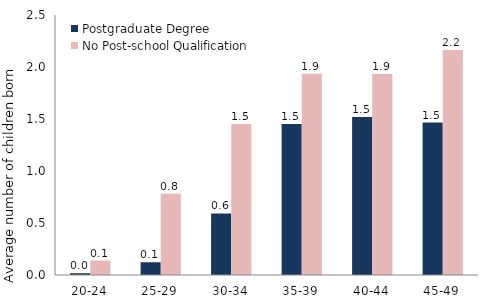
| Category | Postgraduate Degree | No Post-school Qualification |
|---|---|---|
| 20-24 | 0.017 | 0.139 |
| 25-29 | 0.123 | 0.782 |
| 30-34 | 0.592 | 1.453 |
| 35-39 | 1.452 | 1.936 |
| 40-44 | 1.52 | 1.934 |
| 45-49 | 1.466 | 2.163 |